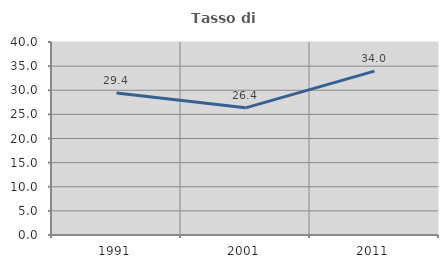
| Category | Tasso di occupazione   |
|---|---|
| 1991.0 | 29.41 |
| 2001.0 | 26.357 |
| 2011.0 | 33.963 |